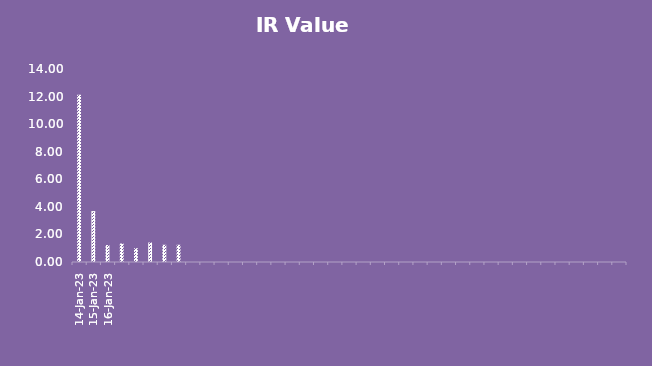
| Category | Series 0 |
|---|---|
| 14-Jan-23 | 12.126 |
| 15-Jan-23 | 3.693 |
| 16-Jan-23 | 1.231 |